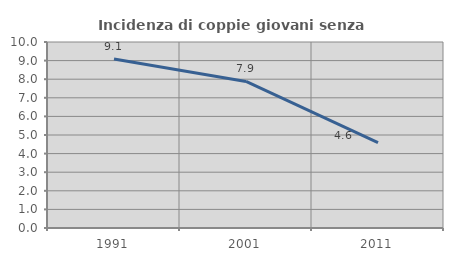
| Category | Incidenza di coppie giovani senza figli |
|---|---|
| 1991.0 | 9.091 |
| 2001.0 | 7.879 |
| 2011.0 | 4.592 |